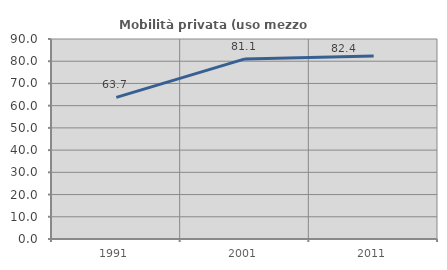
| Category | Mobilità privata (uso mezzo privato) |
|---|---|
| 1991.0 | 63.732 |
| 2001.0 | 81.053 |
| 2011.0 | 82.368 |